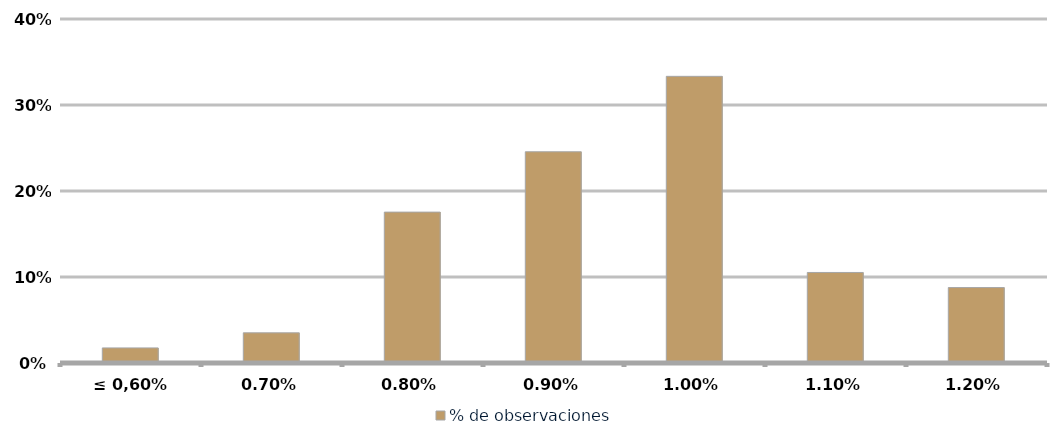
| Category | % de observaciones  |
|---|---|
| ≤ 0,60% | 0.018 |
| 0,70% | 0.035 |
| 0,80% | 0.175 |
| 0,90% | 0.246 |
| 0,01 | 0.333 |
| 1,10% | 0.105 |
| 1,20% | 0.088 |